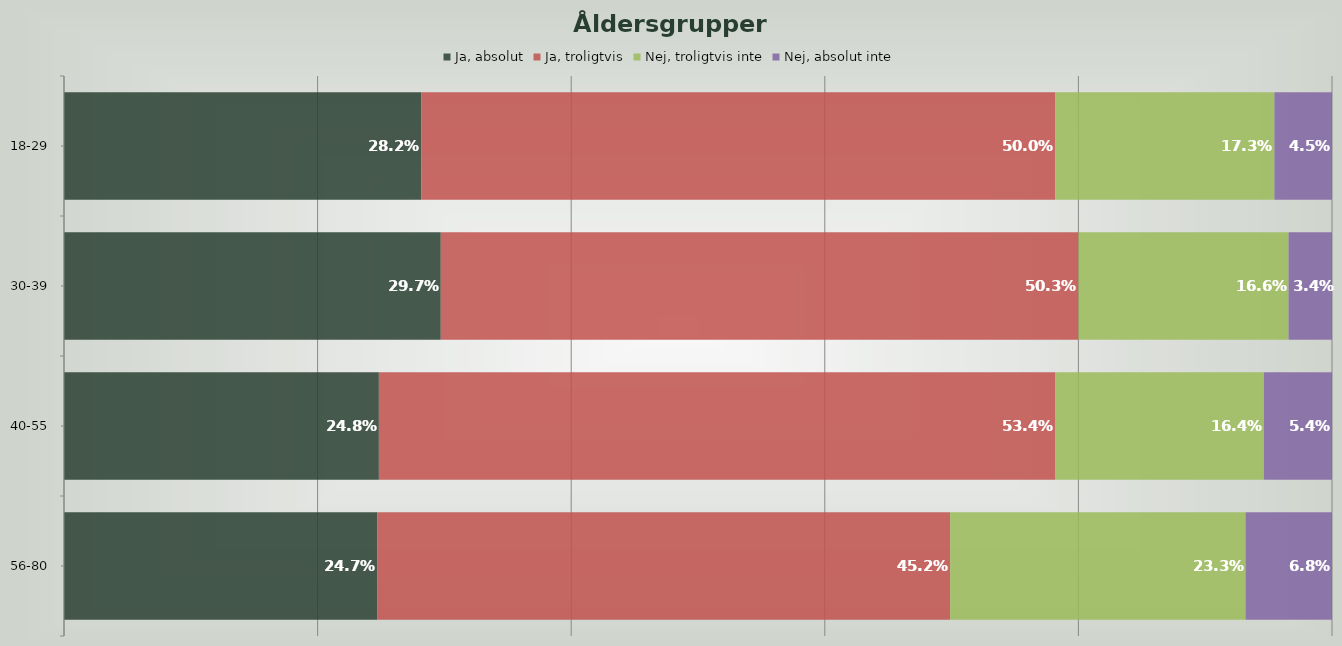
| Category | Ja, absolut | Ja, troligtvis | Nej, troligtvis inte | Nej, absolut inte |
|---|---|---|---|---|
| 18-29 | 0.282 | 0.5 | 0.173 | 0.045 |
| 30-39 | 0.297 | 0.503 | 0.166 | 0.034 |
| 40-55 | 0.248 | 0.534 | 0.164 | 0.054 |
| 56-80 | 0.247 | 0.452 | 0.233 | 0.068 |